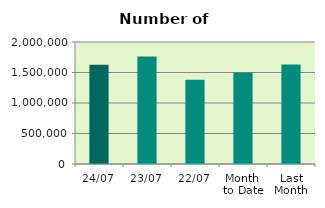
| Category | Series 0 |
|---|---|
| 24/07 | 1627954 |
| 23/07 | 1762480 |
| 22/07 | 1380680 |
| Month 
to Date | 1499132.222 |
| Last
Month | 1630183.4 |